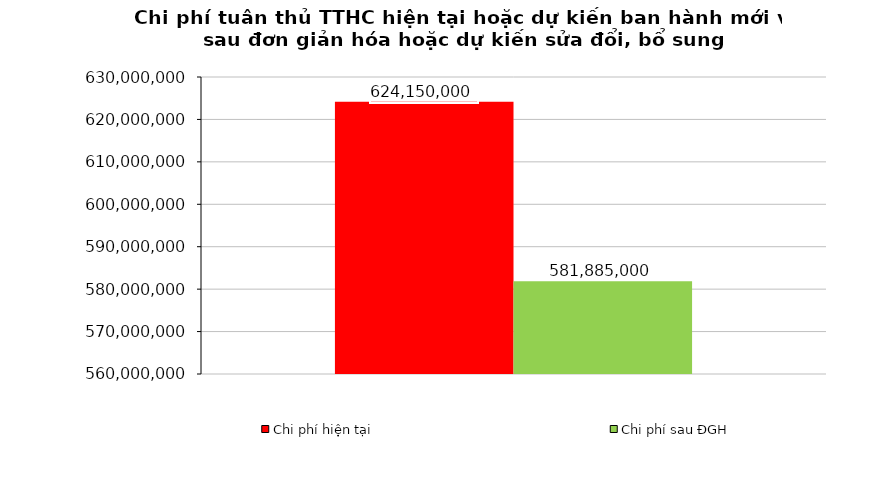
| Category | Chi phí hiện tại | Chi phí sau ĐGH |
|---|---|---|
| 0 | 624150000 | 581885000 |